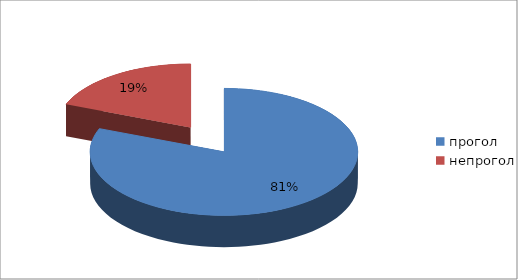
| Category | Series 0 |
|---|---|
| прогол | 34 |
| непрогол | 8 |